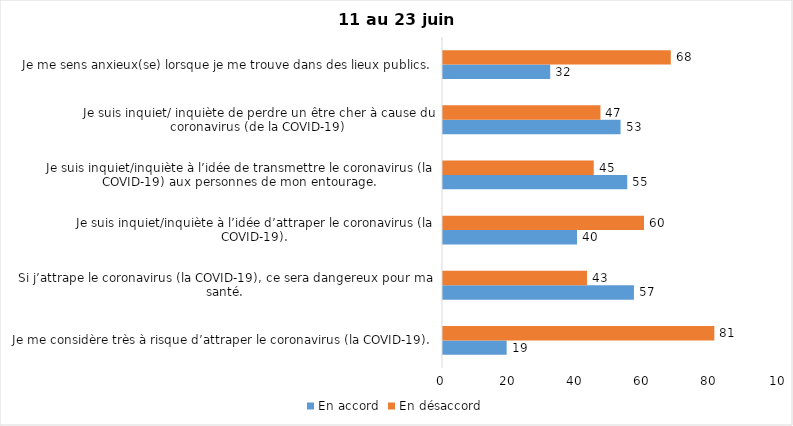
| Category | En accord | En désaccord |
|---|---|---|
| Je me considère très à risque d’attraper le coronavirus (la COVID-19). | 19 | 81 |
| Si j’attrape le coronavirus (la COVID-19), ce sera dangereux pour ma santé. | 57 | 43 |
| Je suis inquiet/inquiète à l’idée d’attraper le coronavirus (la COVID-19). | 40 | 60 |
| Je suis inquiet/inquiète à l’idée de transmettre le coronavirus (la COVID-19) aux personnes de mon entourage. | 55 | 45 |
| Je suis inquiet/ inquiète de perdre un être cher à cause du coronavirus (de la COVID-19) | 53 | 47 |
| Je me sens anxieux(se) lorsque je me trouve dans des lieux publics. | 32 | 68 |